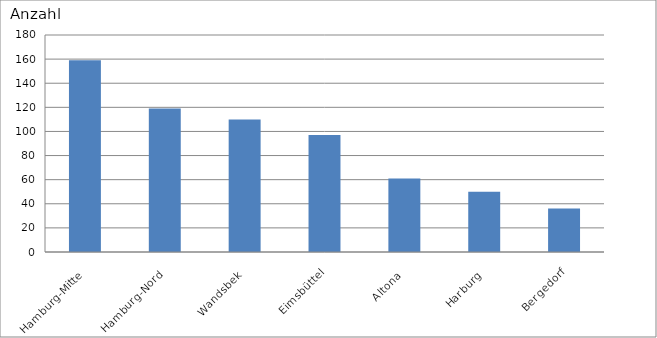
| Category | Hamburg-Mitte Hamburg-Nord Wandsbek Eimsbüttel Altona Harburg Bergedorf |
|---|---|
| Hamburg-Mitte | 159 |
| Hamburg-Nord | 119 |
| Wandsbek | 110 |
| Eimsbüttel | 97 |
| Altona | 61 |
| Harburg | 50 |
| Bergedorf | 36 |